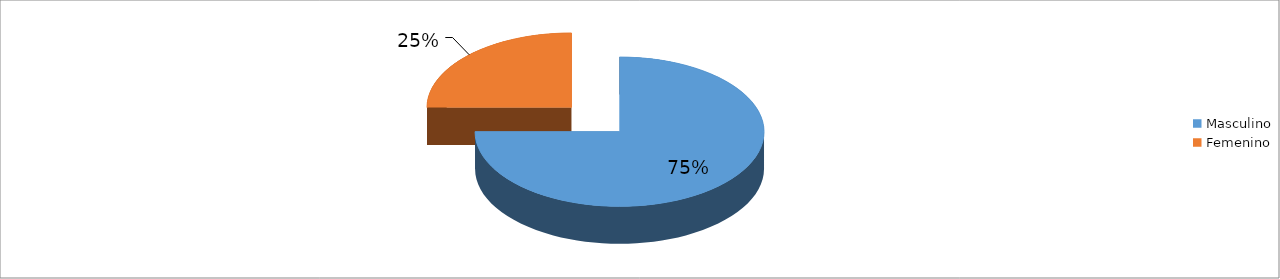
| Category | Series 0 |
|---|---|
| Masculino | 0.75 |
| Femenino | 0.25 |